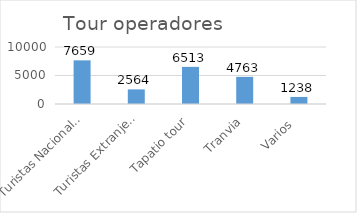
| Category | Total General  |
|---|---|
| Turistas Nacionales  | 7659 |
| Turistas Extranjeros  | 2564 |
| Tapatio tour | 6513 |
| Tranvia | 4763 |
| Varios  | 1238 |